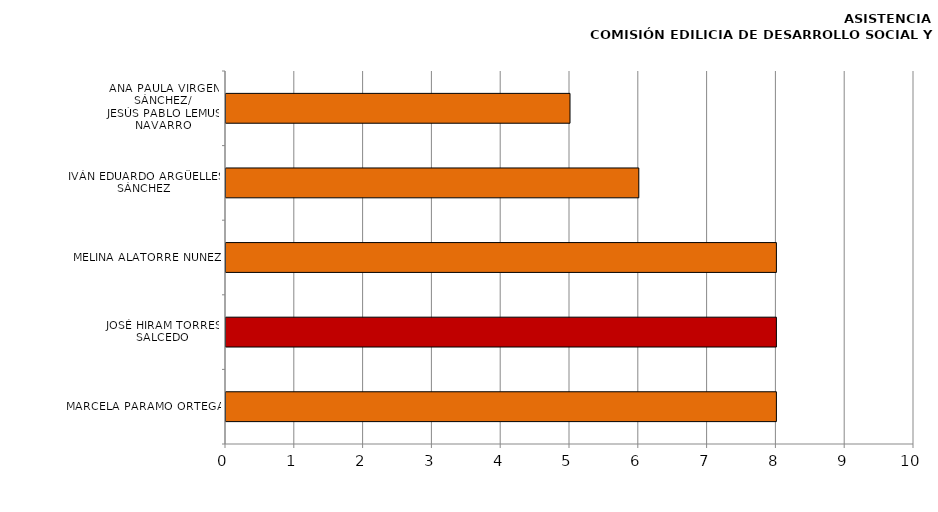
| Category | Series 0 |
|---|---|
| MARCELA PÁRAMO ORTEGA | 8 |
| JOSÉ HIRAM TORRES SALCEDO | 8 |
| MELINA ALATORRE NÚÑEZ | 8 |
| IVÁN EDUARDO ARGÜELLES SÁNCHEZ | 6 |
| ANA PAULA VIRGEN SÁNCHEZ/
JESÚS PABLO LEMUS NAVARRO | 5 |